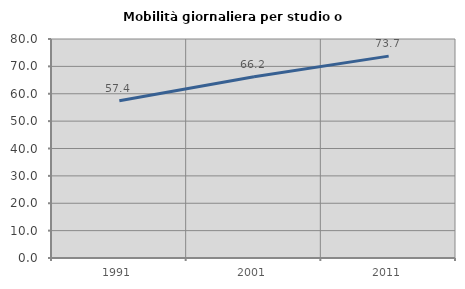
| Category | Mobilità giornaliera per studio o lavoro |
|---|---|
| 1991.0 | 57.412 |
| 2001.0 | 66.19 |
| 2011.0 | 73.739 |